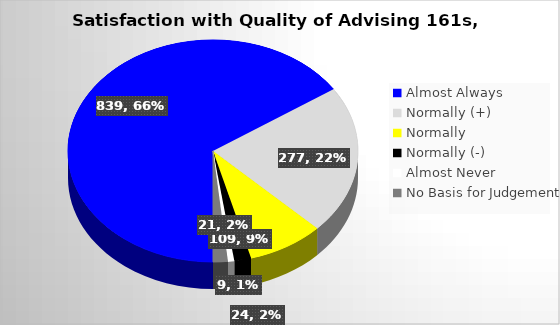
| Category | Series 0 |
|---|---|
| Almost Always | 839 |
| Normally (+) | 277 |
| Normally  | 109 |
| Normally (-) | 24 |
| Almost Never | 9 |
| No Basis for Judgement | 21 |